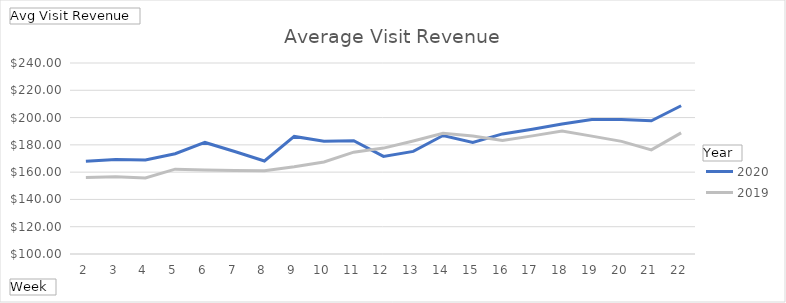
| Category | 2020 | 2019 |
|---|---|---|
| 2 | 167.994 | 156.109 |
| 3 | 169.327 | 156.64 |
| 4 | 168.939 | 155.745 |
| 5 | 173.519 | 162.175 |
| 6 | 181.766 | 161.494 |
| 7 | 175.166 | 161.251 |
| 8 | 168.165 | 161.091 |
| 9 | 186.152 | 164.025 |
| 10 | 182.607 | 167.49 |
| 11 | 183.057 | 174.626 |
| 12 | 171.537 | 177.633 |
| 13 | 175.229 | 182.776 |
| 14 | 186.863 | 188.422 |
| 15 | 181.785 | 186.426 |
| 16 | 188.022 | 183.265 |
| 17 | 191.443 | 186.581 |
| 18 | 195.244 | 190.16 |
| 19 | 198.56 | 186.403 |
| 20 | 198.5 | 182.573 |
| 21 | 197.604 | 176.309 |
| 22 | 208.689 | 188.766 |